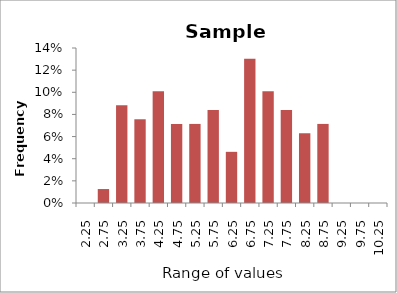
| Category | Sample 1 |
|---|---|
| 2.25 | 0 |
| 2.75 | 0.013 |
| 3.25 | 0.088 |
| 3.75 | 0.076 |
| 4.25 | 0.101 |
| 4.75 | 0.071 |
| 5.25 | 0.071 |
| 5.75 | 0.084 |
| 6.25 | 0.046 |
| 6.75 | 0.13 |
| 7.25 | 0.101 |
| 7.75 | 0.084 |
| 8.25 | 0.063 |
| 8.75 | 0.071 |
| 9.25 | 0 |
| 9.75 | 0 |
| 10.25 | 0 |